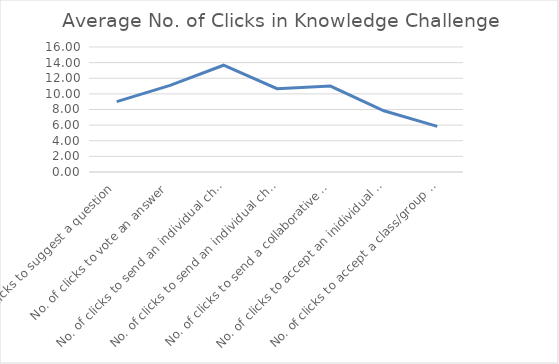
| Category | Series 0 |
|---|---|
| No. of clicks to suggest a question | 9 |
| No. of clicks to vote an answer | 11.083 |
| No. of clicks to send an individual challenge to another user | 13.667 |
| No. of clicks to send an individual challenge to another group | 10.667 |
| No. of clicks to send a collaborative challenge | 11 |
| No. of clicks to accept an inidividual challenge | 7.833 |
| No. of clicks to accept a class/group challenge | 5.833 |